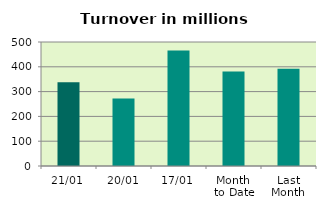
| Category | Series 0 |
|---|---|
| 21/01 | 337.31 |
| 20/01 | 272.19 |
| 17/01 | 465.35 |
| Month 
to Date | 380.642 |
| Last
Month | 391.769 |